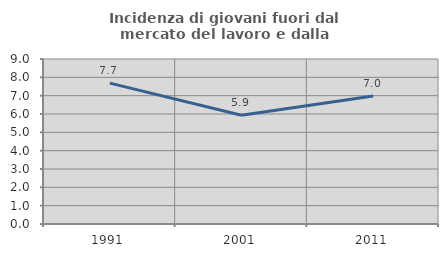
| Category | Incidenza di giovani fuori dal mercato del lavoro e dalla formazione  |
|---|---|
| 1991.0 | 7.685 |
| 2001.0 | 5.933 |
| 2011.0 | 6.979 |